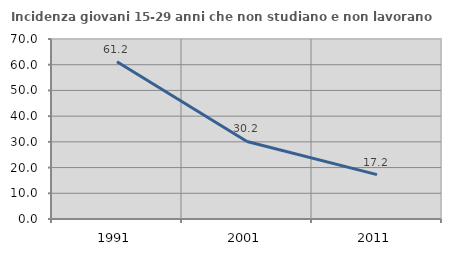
| Category | Incidenza giovani 15-29 anni che non studiano e non lavorano  |
|---|---|
| 1991.0 | 61.164 |
| 2001.0 | 30.159 |
| 2011.0 | 17.241 |